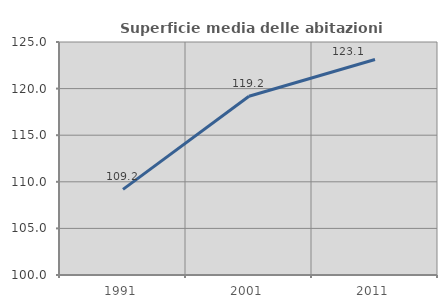
| Category | Superficie media delle abitazioni occupate |
|---|---|
| 1991.0 | 109.183 |
| 2001.0 | 119.174 |
| 2011.0 | 123.116 |